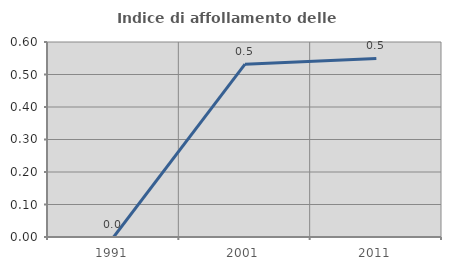
| Category | Indice di affollamento delle abitazioni  |
|---|---|
| 1991.0 | 0 |
| 2001.0 | 0.532 |
| 2011.0 | 0.549 |